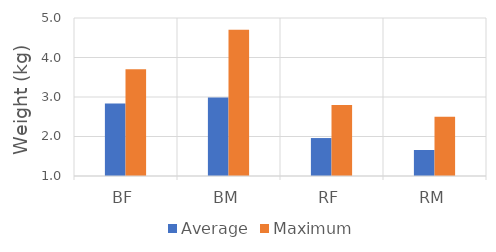
| Category | Average | Maximum |
|---|---|---|
| BF | 2.833 | 3.7 |
| BM | 2.986 | 4.7 |
| RF | 1.961 | 2.8 |
| RM | 1.659 | 2.5 |